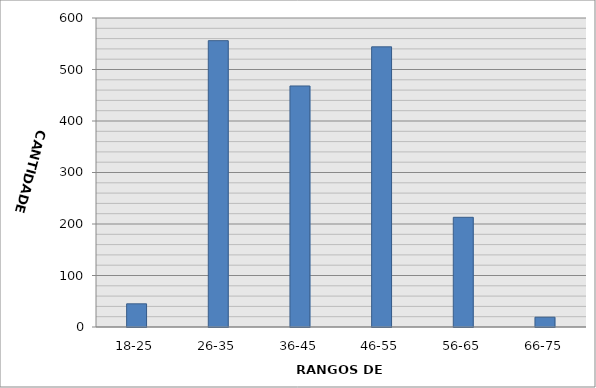
| Category | Series 0 |
|---|---|
| 18-25 | 45 |
| 26-35 | 556 |
| 36-45 | 468 |
| 46-55 | 544 |
| 56-65 | 213 |
| 66-75 | 19 |